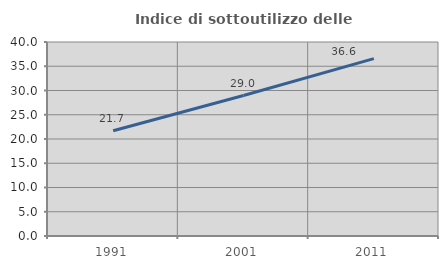
| Category | Indice di sottoutilizzo delle abitazioni  |
|---|---|
| 1991.0 | 21.697 |
| 2001.0 | 28.957 |
| 2011.0 | 36.563 |